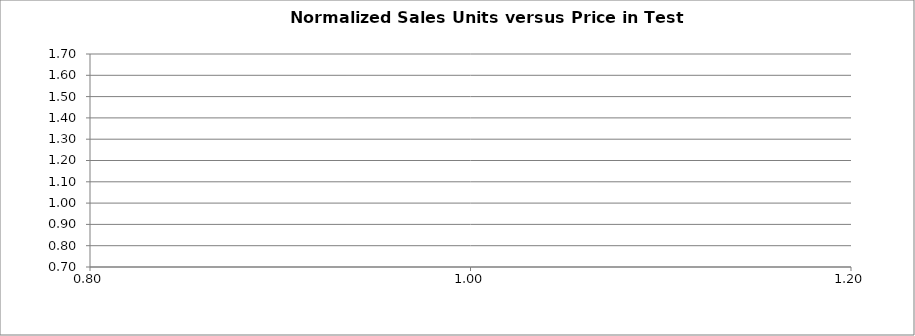
| Category | Normalized Test Data |
|---|---|
| 0.95 | 0 |
| 1.05 | 0 |
| 1.16 | 0 |